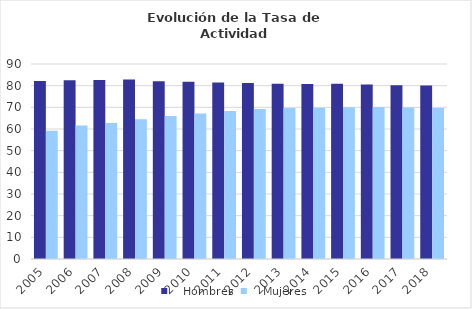
| Category |    Hombres |    Mujeres |
|---|---|---|
| 2005.0 | 82.21 | 59.14 |
| 2006.0 | 82.47 | 61.56 |
| 2007.0 | 82.59 | 62.79 |
| 2008.0 | 82.82 | 64.52 |
| 2009.0 | 82.03 | 66.03 |
| 2010.0 | 81.81 | 67.14 |
| 2011.0 | 81.46 | 68.27 |
| 2012.0 | 81.22 | 69.26 |
| 2013.0 | 80.9 | 69.67 |
| 2014.0 | 80.72 | 69.77 |
| 2015.0 | 80.86 | 70.02 |
| 2016.0 | 80.5 | 70.2 |
| 2017.0 | 80.23 | 69.9 |
| 2018.0 | 80.1 | 69.7 |